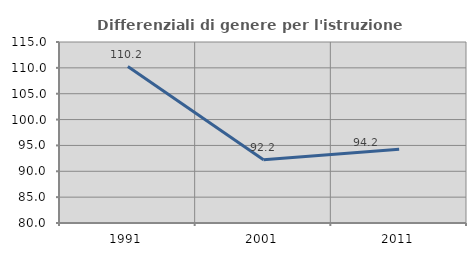
| Category | Differenziali di genere per l'istruzione superiore |
|---|---|
| 1991.0 | 110.244 |
| 2001.0 | 92.23 |
| 2011.0 | 94.241 |